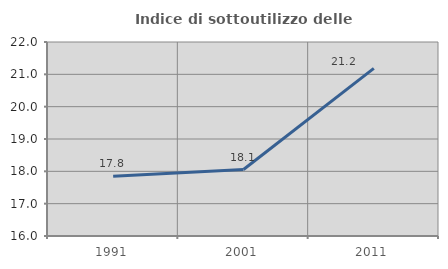
| Category | Indice di sottoutilizzo delle abitazioni  |
|---|---|
| 1991.0 | 17.849 |
| 2001.0 | 18.055 |
| 2011.0 | 21.185 |